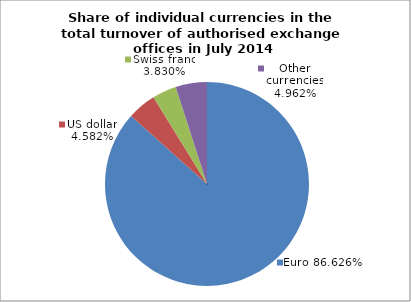
| Category | EUR |
|---|---|
| 0 | 0.866 |
| 1 | 0.046 |
| 2 | 0.038 |
| 3 | 0.05 |